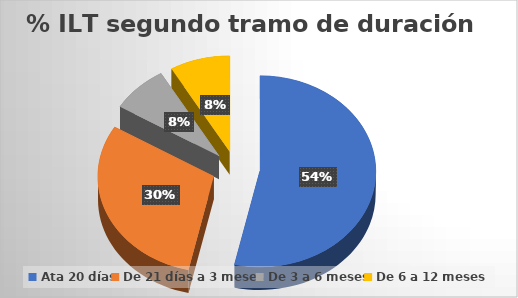
| Category | Series 6 |
|---|---|
| Ata 20 días | 275 |
| De 21 días a 3 meses | 155 |
| De 3 a 6 meses | 41 |
| De 6 a 12 meses | 43 |